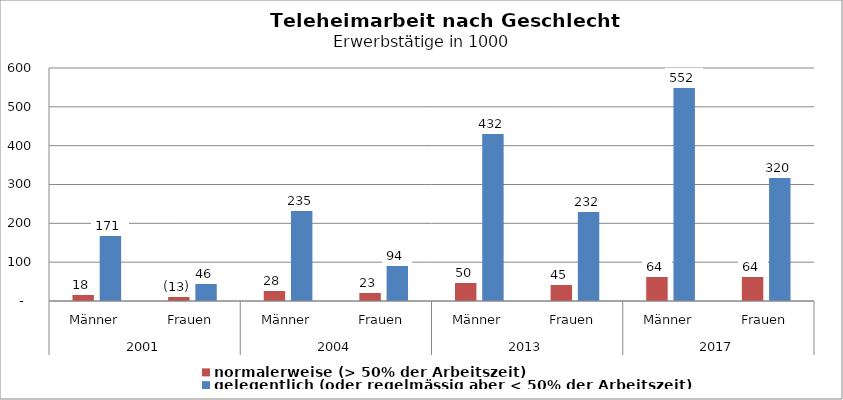
| Category | normalerweise (> 50% der Arbeitszeit) | gelegentlich (oder regelmässig aber < 50% der Arbeitszeit) |
|---|---|---|
| 0 | 18.319 | 170.561 |
| 1 | 13.027 | 46.392 |
| 2 | 28.41 | 235.487 |
| 3 | 23.255 | 93.541 |
| 4 | 49.817 | 431.872 |
| 5 | 44.586 | 232.221 |
| 6 | 63.508 | 551.538 |
| 7 | 64.472 | 319.99 |